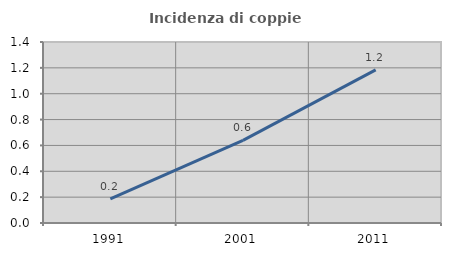
| Category | Incidenza di coppie miste |
|---|---|
| 1991.0 | 0.186 |
| 2001.0 | 0.639 |
| 2011.0 | 1.185 |